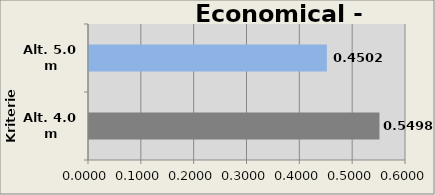
| Category | Contingency |
|---|---|
| Alt. 4.0 m | 0.55 |
| Alt. 5.0 m | 0.45 |